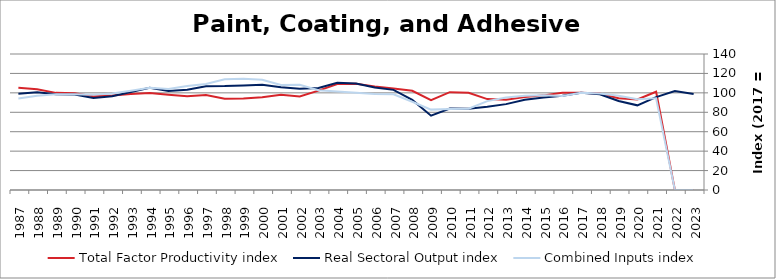
| Category | Total Factor Productivity index | Real Sectoral Output index | Combined Inputs index |
|---|---|---|---|
| 2023.0 | 0 | 98.891 | 0 |
| 2022.0 | 0 | 101.956 | 0 |
| 2021.0 | 101.162 | 95.568 | 94.47 |
| 2020.0 | 93.189 | 87.163 | 93.534 |
| 2019.0 | 94.42 | 91.699 | 97.118 |
| 2018.0 | 99.29 | 98.605 | 99.31 |
| 2017.0 | 100 | 100 | 100 |
| 2016.0 | 100.223 | 97.06 | 96.844 |
| 2015.0 | 97.417 | 95.127 | 97.648 |
| 2014.0 | 95.606 | 92.81 | 97.075 |
| 2013.0 | 92.833 | 88.385 | 95.209 |
| 2012.0 | 93.576 | 85.629 | 91.507 |
| 2011.0 | 100.069 | 83.751 | 83.694 |
| 2010.0 | 100.676 | 83.874 | 83.311 |
| 2009.0 | 92.412 | 76.465 | 82.744 |
| 2008.0 | 102.072 | 92.772 | 90.889 |
| 2007.0 | 104.603 | 103.066 | 98.531 |
| 2006.0 | 106.67 | 105.43 | 98.838 |
| 2005.0 | 109.456 | 109.57 | 100.104 |
| 2004.0 | 109.003 | 110.477 | 101.353 |
| 2003.0 | 102.276 | 105.018 | 102.68 |
| 2002.0 | 96.305 | 104.255 | 108.255 |
| 2001.0 | 98.021 | 105.89 | 108.029 |
| 2000.0 | 95.594 | 108.456 | 113.455 |
| 1999.0 | 94.086 | 107.693 | 114.462 |
| 1998.0 | 93.895 | 106.966 | 113.921 |
| 1997.0 | 97.813 | 106.837 | 109.226 |
| 1996.0 | 96.399 | 103.237 | 107.094 |
| 1995.0 | 97.965 | 101.846 | 103.961 |
| 1994.0 | 99.864 | 105.147 | 105.291 |
| 1993.0 | 98.859 | 100.943 | 102.108 |
| 1992.0 | 97.329 | 96.612 | 99.263 |
| 1991.0 | 96.583 | 94.708 | 98.059 |
| 1990.0 | 99.487 | 98.184 | 98.69 |
| 1989.0 | 99.983 | 98.481 | 98.497 |
| 1988.0 | 103.73 | 100.55 | 96.934 |
| 1987.0 | 105.319 | 99.097 | 94.092 |